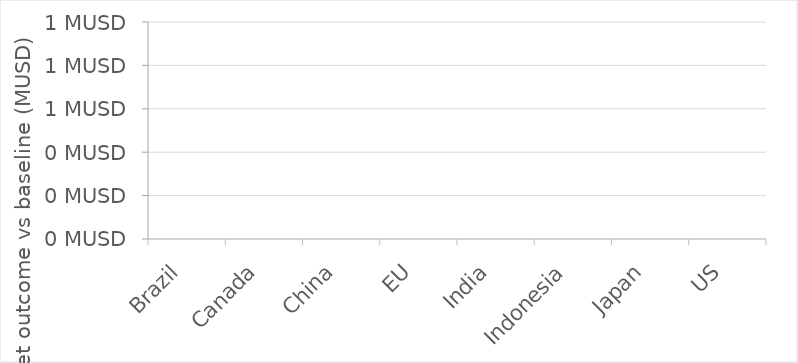
| Category | Series 0 |
|---|---|
| Brazil | 0 |
| Canada | 0 |
| China | 0 |
| EU | 0 |
| India | 0 |
| Indonesia | 0 |
| Japan | 0 |
| US | 0 |